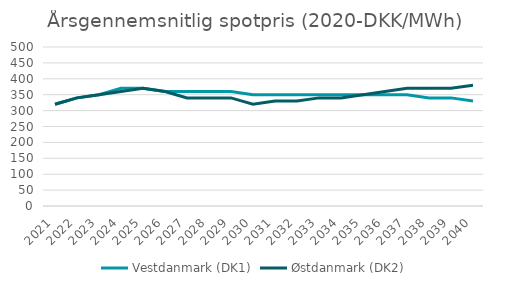
| Category | Vestdanmark (DK1) | Østdanmark (DK2) |
|---|---|---|
| 2021.0 | 320 | 320 |
| 2022.0 | 340 | 340 |
| 2023.0 | 350 | 350 |
| 2024.0 | 370 | 360 |
| 2025.0 | 370 | 370 |
| 2026.0 | 360 | 360 |
| 2027.0 | 360 | 340 |
| 2028.0 | 360 | 340 |
| 2029.0 | 360 | 340 |
| 2030.0 | 350 | 320 |
| 2031.0 | 350 | 330 |
| 2032.0 | 350 | 330 |
| 2033.0 | 350 | 340 |
| 2034.0 | 350 | 340 |
| 2035.0 | 350 | 350 |
| 2036.0 | 350 | 360 |
| 2037.0 | 350 | 370 |
| 2038.0 | 340 | 370 |
| 2039.0 | 340 | 370 |
| 2040.0 | 330 | 380 |